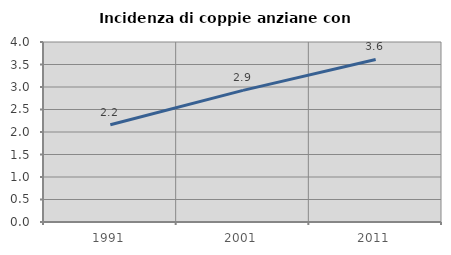
| Category | Incidenza di coppie anziane con figli |
|---|---|
| 1991.0 | 2.16 |
| 2001.0 | 2.925 |
| 2011.0 | 3.612 |